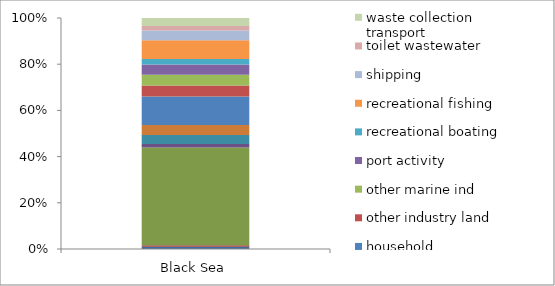
| Category | agriculture | aquaculture | coast beach tourism | construction and demolition | dumps and landfills | fishing | household | other industry land | other marine ind | port activity | recreational boating | recreational fishing | shipping | toilet wastewater | waste collection transport |
|---|---|---|---|---|---|---|---|---|---|---|---|---|---|---|---|
| Black Sea | 1421.5 | 1011.5 | 65082.5 | 2379.75 | 6008.5 | 6593.25 | 19094.5 | 7313 | 7035 | 6863.5 | 3592.75 | 12642.75 | 6489.75 | 2937.5 | 5302.25 |